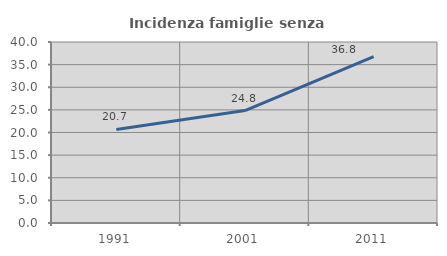
| Category | Incidenza famiglie senza nuclei |
|---|---|
| 1991.0 | 20.667 |
| 2001.0 | 24.842 |
| 2011.0 | 36.777 |